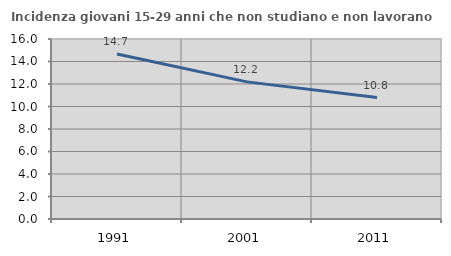
| Category | Incidenza giovani 15-29 anni che non studiano e non lavorano  |
|---|---|
| 1991.0 | 14.662 |
| 2001.0 | 12.188 |
| 2011.0 | 10.797 |